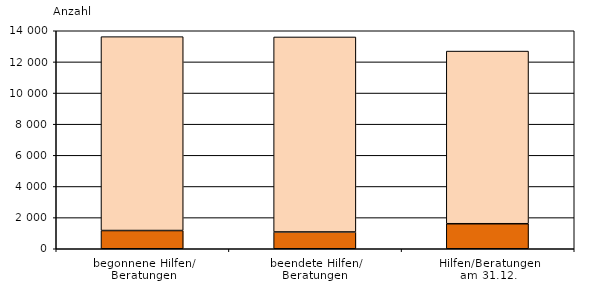
| Category | Series 0 | Series 1 |
|---|---|---|
| begonnene Hilfen/
Beratungen | 1171 | 12451 |
| beendete Hilfen/
Beratungen  | 1078 | 12524 |
| Hilfen/Beratungen
am 31.12. | 1607 | 11088 |